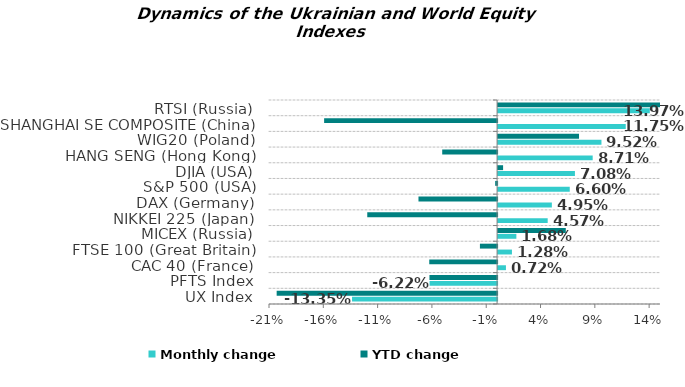
| Category | Monthly change | YTD change |
|---|---|---|
| UX Index | -0.134 | -0.203 |
| PFTS Index | -0.062 | -0.062 |
| CAC 40 (France) | 0.007 | -0.062 |
| FTSE 100 (Great Britain) | 0.013 | -0.016 |
| MICEX (Russia) | 0.017 | 0.062 |
| NIKKEI 225 (Japan) | 0.046 | -0.12 |
| DAX (Germany) | 0.05 | -0.072 |
| S&P 500 (USA) | 0.066 | -0.002 |
| DJIA (USA) | 0.071 | 0.005 |
| HANG SENG (Hong Kong) | 0.087 | -0.051 |
| WIG20 (Poland) | 0.095 | 0.075 |
| SHANGHAI SE COMPOSITE (China) | 0.118 | -0.159 |
| RTSI (Russia) | 0.14 | 0.157 |